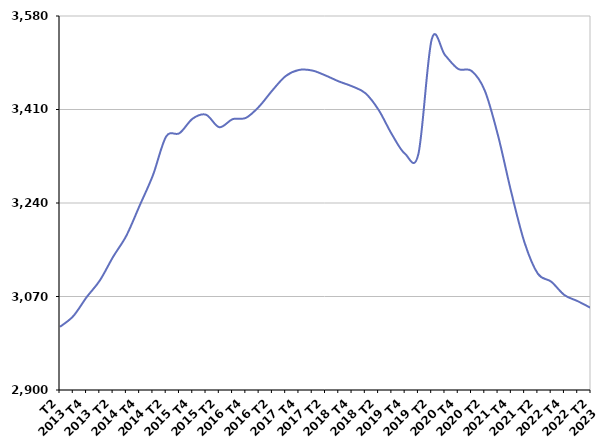
| Category | De 25 à 49 ans |
|---|---|
| T2
2013 | 3014.9 |
| T3
2013 | 3034.3 |
| T4
2013 | 3068.6 |
| T1
2014 | 3099.1 |
| T2
2014 | 3142.1 |
| T3
2014 | 3180.6 |
| T4
2014 | 3235.3 |
| T1
2015 | 3290.5 |
| T2
2015 | 3361 |
| T3
2015 | 3366.9 |
| T4
2015 | 3393.5 |
| T1
2016 | 3400.5 |
| T2
2016 | 3377.8 |
| T3
2016 | 3392.4 |
| T4
2016 | 3394.7 |
| T1
2017 | 3415.4 |
| T2
2017 | 3444.8 |
| T3
2017 | 3470.8 |
| T4
2017 | 3481.9 |
| T1
2018 | 3480.9 |
| T2
2018 | 3471.9 |
| T3
2018 | 3461.1 |
| T4
2018 | 3452.2 |
| T1
2019 | 3439.7 |
| T2
2019 | 3409.3 |
| T3
2019 | 3364.9 |
| T4
2019 | 3329.2 |
| T1
2020 | 3329.4 |
| T2
2020 | 3537.6 |
| T3
2020 | 3509 |
| T4
2020 | 3483.7 |
| T1
2021 | 3480.2 |
| T2
2021 | 3444.3 |
| T3
2021 | 3362.3 |
| T4
2021 | 3259 |
| T1
2022 | 3167.6 |
| T2
2022 | 3111.3 |
| T3
2022 | 3097 |
| T4
2022 | 3072.6 |
| T1
2023 | 3061.5 |
| T2
2023 | 3049 |